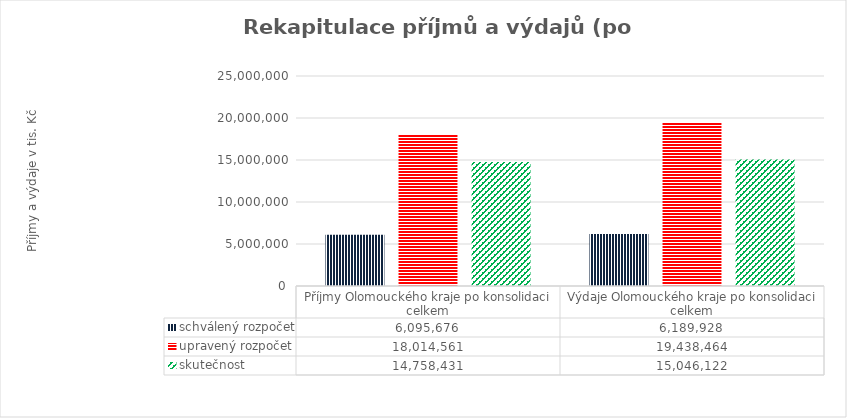
| Category | schválený rozpočet | upravený rozpočet | skutečnost |
|---|---|---|---|
| Příjmy Olomouckého kraje po konsolidaci celkem | 6095676 | 18014561 | 14758431 |
| Výdaje Olomouckého kraje po konsolidaci celkem | 6189928 | 19438464 | 15046122 |